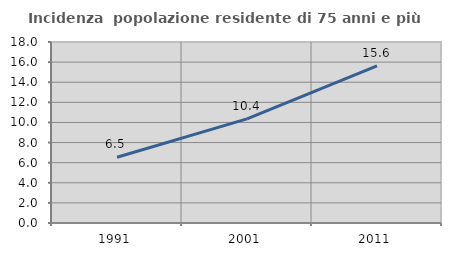
| Category | Incidenza  popolazione residente di 75 anni e più |
|---|---|
| 1991.0 | 6.535 |
| 2001.0 | 10.352 |
| 2011.0 | 15.632 |